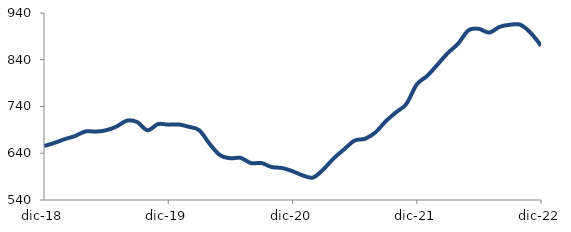
| Category | Series 0 |
|---|---|
| 2018-12-01 | 655.34 |
| 2019-01-01 | 662.041 |
| 2019-02-01 | 670.134 |
| 2019-03-01 | 676.827 |
| 2019-04-01 | 686.669 |
| 2019-05-01 | 686.255 |
| 2019-06-01 | 689.181 |
| 2019-07-01 | 697.076 |
| 2019-08-01 | 709.635 |
| 2019-09-01 | 706.734 |
| 2019-10-01 | 689.137 |
| 2019-11-01 | 702.277 |
| 2019-12-01 | 701.214 |
| 2020-01-01 | 701.517 |
| 2020-02-01 | 696.552 |
| 2020-03-01 | 689.099 |
| 2020-04-01 | 659.896 |
| 2020-05-01 | 635.894 |
| 2020-06-01 | 629.29 |
| 2020-07-01 | 629.994 |
| 2020-08-01 | 618.866 |
| 2020-09-01 | 619.022 |
| 2020-10-01 | 610.428 |
| 2020-11-01 | 608.402 |
| 2020-12-01 | 601.605 |
| 2021-01-01 | 592.504 |
| 2021-02-01 | 588.185 |
| 2021-03-01 | 605.989 |
| 2021-04-01 | 629.446 |
| 2021-05-01 | 648.73 |
| 2021-06-01 | 667.177 |
| 2021-07-01 | 670.996 |
| 2021-08-01 | 684.389 |
| 2021-09-01 | 708.308 |
| 2021-10-01 | 727.608 |
| 2021-11-01 | 745.65 |
| 2021-12-01 | 787.184 |
| 2022-01-01 | 805.308 |
| 2022-02-01 | 829.502 |
| 2022-03-01 | 854.336 |
| 2022-04-01 | 874.453 |
| 2022-05-01 | 903.049 |
| 2022-06-01 | 906.022 |
| 2022-07-01 | 898.071 |
| 2022-08-01 | 910.353 |
| 2022-09-01 | 914.859 |
| 2022-10-01 | 914.857 |
| 2022-11-01 | 897.607 |
| 2022-12-01 | 870.196 |